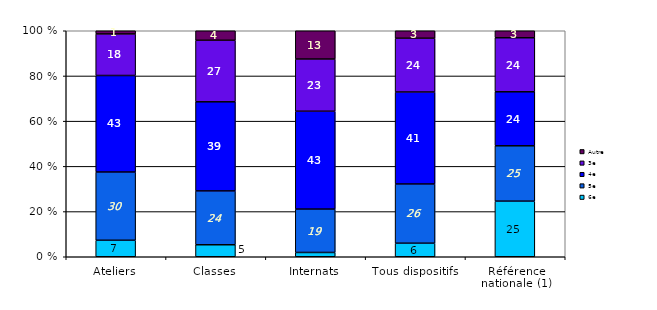
| Category | 6e | 5e | 4e | 3e | Autre |
|---|---|---|---|---|---|
| Ateliers | 7.3 | 30.2 | 42.7 | 18.4 | 1.4 |
| Classes | 5.3 | 23.8 | 39.4 | 27.2 | 4.2 |
| Internats | 1.9 | 19.2 | 43.3 | 23.1 | 12.5 |
| Tous dispositifs | 6 | 26.2 | 40.7 | 23.8 | 3.3 |
| Référence nationale (1) | 24.6 | 24.5 | 23.9 | 23.9 | 3.1 |